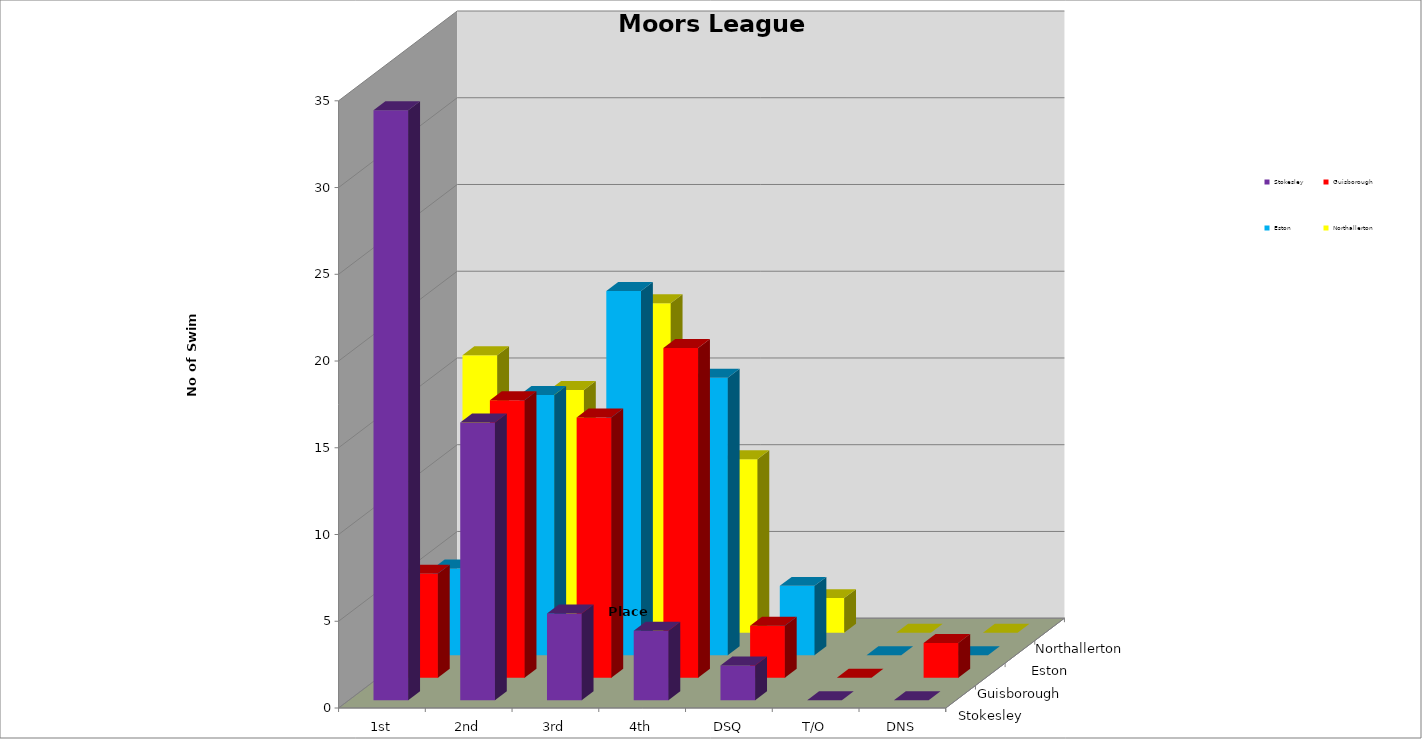
| Category | Stokesley | Guisborough | Eston | Northallerton |
|---|---|---|---|---|
| 1st | 34 | 6 | 5 | 16 |
| 2nd | 16 | 16 | 15 | 14 |
| 3rd | 5 | 15 | 21 | 19 |
| 4th | 4 | 19 | 16 | 10 |
| DSQ | 2 | 3 | 4 | 2 |
| T/O | 0 | 0 | 0 | 0 |
| DNS | 0 | 2 | 0 | 0 |